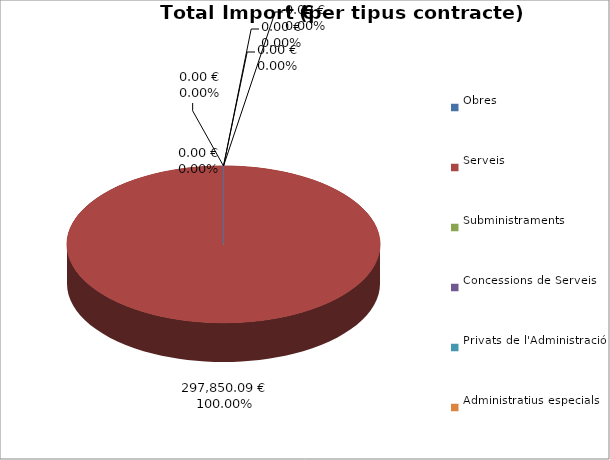
| Category | Total preu
(amb IVA) |
|---|---|
| Obres | 0 |
| Serveis | 297850.09 |
| Subministraments | 0 |
| Concessions de Serveis | 0 |
| Privats de l'Administració | 0 |
| Administratius especials | 0 |